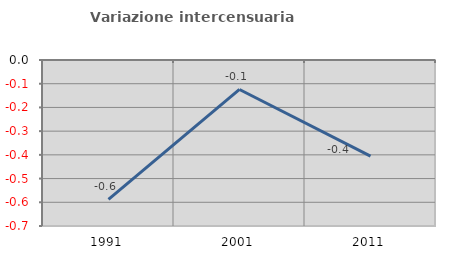
| Category | Variazione intercensuaria annua |
|---|---|
| 1991.0 | -0.587 |
| 2001.0 | -0.124 |
| 2011.0 | -0.405 |